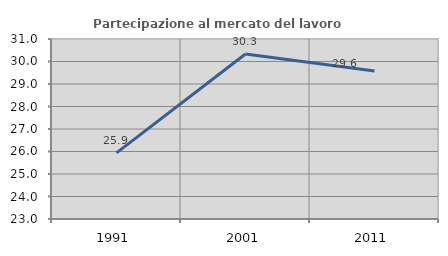
| Category | Partecipazione al mercato del lavoro  femminile |
|---|---|
| 1991.0 | 25.94 |
| 2001.0 | 30.333 |
| 2011.0 | 29.582 |